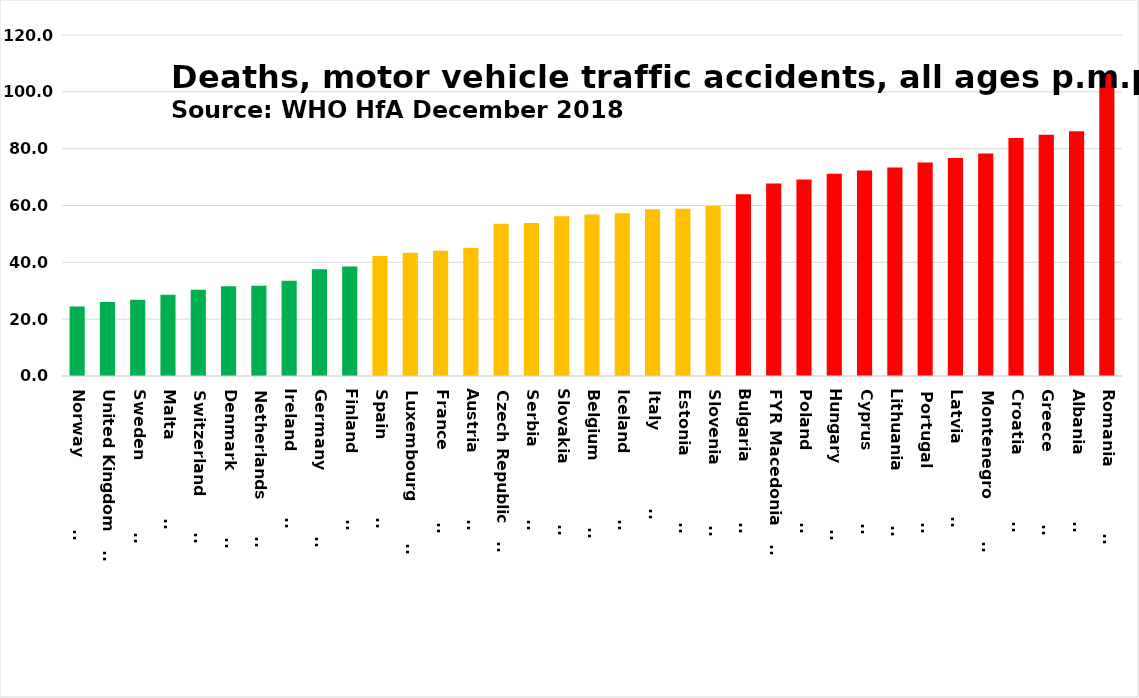
| Category | 2013/l.a. |
|---|---|
| Norway                 | 24.469 |
| United Kingdom         | 26.032 |
| Sweden                 | 26.797 |
| Malta                  | 28.598 |
| Switzerland            | 30.312 |
| Denmark                | 31.619 |
| Netherlands            | 31.803 |
| Ireland                | 33.517 |
| Germany                | 37.555 |
| Finland                | 38.56 |
| Spain                  | 42.223 |
| Luxembourg             | 43.384 |
| France                 | 44.071 |
| Austria                | 45.043 |
| Czech Republic         | 53.564 |
| Serbia                 | 53.843 |
| Slovakia               | 56.175 |
| Belgium                | 56.807 |
| Iceland                | 57.267 |
| Italy                  | 58.671 |
| Estonia                | 58.819 |
| Slovenia               | 59.781 |
| Bulgaria               | 63.964 |
| FYR Macedonia         | 67.755 |
| Poland                 | 69.118 |
| Hungary                | 71.172 |
| Cyprus                 | 72.346 |
| Lithuania              | 73.333 |
| Portugal               | 75.113 |
| Latvia                 | 76.697 |
| Montenegro             | 78.262 |
| Croatia                | 83.787 |
| Greece                 | 84.894 |
| Albania                | 86.097 |
| Romania                | 106.593 |